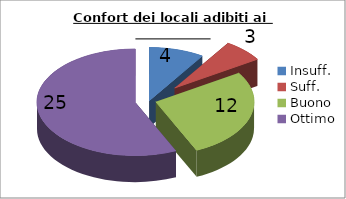
| Category | Confort dei locali adibiti ai prelievi |
|---|---|
| Insuff. | 4 |
| Suff. | 3 |
| Buono | 12 |
| Ottimo | 25 |